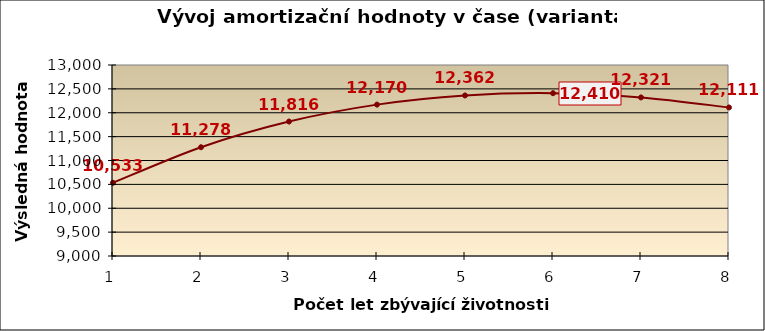
| Category | Series 0 |
|---|---|
| 1.0 | 10533.29 |
| 2.0 | 11277.979 |
| 3.0 | 11815.747 |
| 4.0 | 12170.19 |
| 5.0 | 12362.073 |
| 6.0 | 12409.65 |
| 7.0 | 12320.967 |
| 8.0 | 12110.986 |